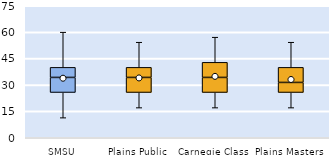
| Category | 25th | 50th | 75th |
|---|---|---|---|
| SMSU | 25.714 | 8.571 | 5.714 |
| Plains Public | 25.714 | 8.571 | 5.714 |
| Carnegie Class | 25.714 | 8.571 | 8.571 |
| Plains Masters | 25.714 | 5.714 | 8.571 |